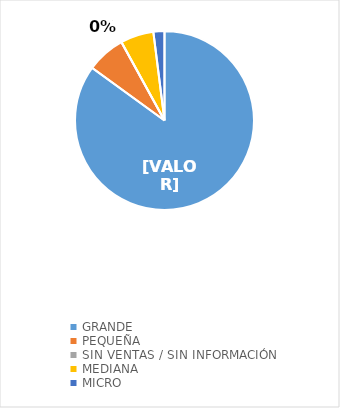
| Category | Series 0 |
|---|---|
| GRANDE | 0.85 |
| PEQUEÑA | 0.07 |
| SIN VENTAS / SIN INFORMACIÓN | 0 |
| MEDIANA | 0.06 |
| MICRO | 0.02 |